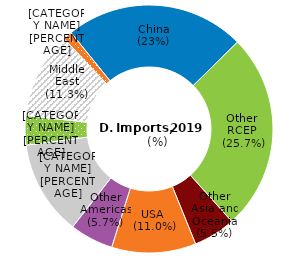
| Category | Share of imports |
|---|---|
| China | 18.454 |
| Other RCEP | 20.233 |
| Other Asia and Oceania | 4.313 |
| USA | 8.64 |
| Other Americas | 4.463 |
| EU | 9.722 |
| Other Europes | 3.005 |
| Middle East | 8.852 |
| Africa | 0.918 |